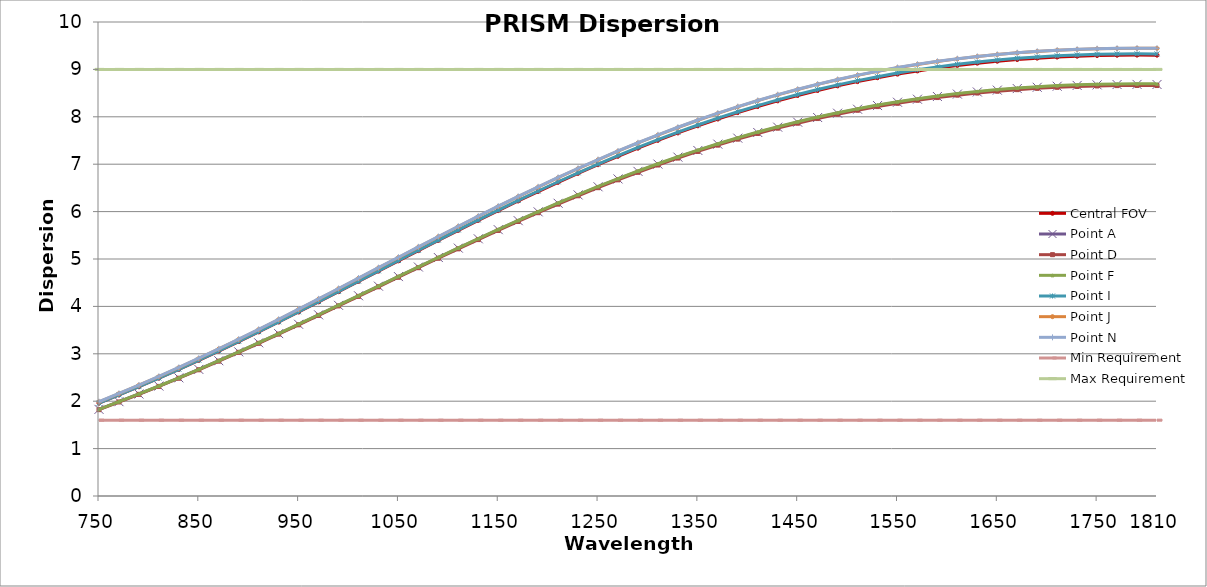
| Category | Central FOV | Point A | Point D | Point F | Point I | Point J | Point N | Min Requirement | Max Requirement |
|---|---|---|---|---|---|---|---|---|---|
| 750.0 | 1.958 | 1.828 | 1.822 | 1.828 | 1.96 | 1.986 | 1.988 | 1.6 | 9 |
| nan | 2.132 | 1.99 | 1.984 | 1.99 | 2.134 | 2.162 | 2.165 | 1.6 | 9 |
| nan | 2.306 | 2.152 | 2.145 | 2.153 | 2.308 | 2.338 | 2.341 | 1.6 | 9 |
| nan | 2.486 | 2.32 | 2.312 | 2.321 | 2.488 | 2.521 | 2.524 | 1.6 | 9 |
| nan | 2.671 | 2.493 | 2.485 | 2.494 | 2.674 | 2.709 | 2.712 | 1.6 | 9 |
| 850.0 | 2.862 | 2.671 | 2.663 | 2.672 | 2.865 | 2.903 | 2.906 | 1.6 | 9 |
| nan | 3.058 | 2.854 | 2.845 | 2.855 | 3.061 | 3.102 | 3.105 | 1.6 | 9 |
| nan | 3.259 | 3.041 | 3.032 | 3.042 | 3.262 | 3.305 | 3.309 | 1.6 | 9 |
| nan | 3.463 | 3.232 | 3.222 | 3.234 | 3.467 | 3.513 | 3.517 | 1.6 | 9 |
| nan | 3.671 | 3.426 | 3.415 | 3.428 | 3.676 | 3.724 | 3.728 | 1.6 | 9 |
| 950.0 | 3.882 | 3.623 | 3.612 | 3.625 | 3.887 | 3.938 | 3.942 | 1.6 | 9 |
| nan | 4.096 | 3.822 | 3.81 | 3.824 | 4.101 | 4.155 | 4.159 | 1.6 | 9 |
| nan | 4.311 | 4.022 | 4.01 | 4.025 | 4.316 | 4.373 | 4.377 | 1.6 | 9 |
| nan | 4.527 | 4.224 | 4.212 | 4.227 | 4.533 | 4.592 | 4.597 | 1.6 | 9 |
| nan | 4.744 | 4.427 | 4.414 | 4.43 | 4.75 | 4.813 | 4.817 | 1.6 | 9 |
| 1050.0 | 4.96 | 4.629 | 4.615 | 4.632 | 4.968 | 5.033 | 5.038 | 1.6 | 9 |
| nan | 5.176 | 4.831 | 4.816 | 4.834 | 5.184 | 5.252 | 5.257 | 1.6 | 9 |
| nan | 5.391 | 5.031 | 5.016 | 5.035 | 5.4 | 5.47 | 5.475 | 1.6 | 9 |
| nan | 5.604 | 5.23 | 5.214 | 5.234 | 5.613 | 5.686 | 5.691 | 1.6 | 9 |
| nan | 5.814 | 5.426 | 5.41 | 5.43 | 5.824 | 5.899 | 5.904 | 1.6 | 9 |
| 1150.0 | 6.021 | 5.619 | 5.602 | 5.624 | 6.031 | 6.109 | 6.115 | 1.6 | 9 |
| nan | 6.224 | 5.808 | 5.792 | 5.814 | 6.235 | 6.316 | 6.321 | 1.6 | 9 |
| nan | 6.423 | 5.994 | 5.977 | 6 | 6.435 | 6.518 | 6.523 | 1.6 | 9 |
| nan | 6.618 | 6.176 | 6.158 | 6.182 | 6.63 | 6.715 | 6.72 | 1.6 | 9 |
| nan | 6.806 | 6.352 | 6.334 | 6.358 | 6.819 | 6.907 | 6.912 | 1.6 | 9 |
| 1250.0 | 6.99 | 6.523 | 6.505 | 6.53 | 7.003 | 7.094 | 7.099 | 1.6 | 9 |
| nan | 7.167 | 6.689 | 6.67 | 6.696 | 7.182 | 7.274 | 7.279 | 1.6 | 9 |
| nan | 7.338 | 6.849 | 6.829 | 6.856 | 7.353 | 7.448 | 7.453 | 1.6 | 9 |
| nan | 7.503 | 7.002 | 6.982 | 7.01 | 7.518 | 7.614 | 7.62 | 1.6 | 9 |
| nan | 7.66 | 7.149 | 7.129 | 7.157 | 7.676 | 7.774 | 7.78 | 1.6 | 9 |
| 1350.0 | 7.81 | 7.29 | 7.269 | 7.298 | 7.827 | 7.927 | 7.932 | 1.6 | 9 |
| nan | 7.953 | 7.423 | 7.402 | 7.432 | 7.971 | 8.072 | 8.077 | 1.6 | 9 |
| nan | 8.089 | 7.55 | 7.529 | 7.559 | 8.107 | 8.21 | 8.215 | 1.6 | 9 |
| nan | 8.217 | 7.669 | 7.648 | 7.678 | 8.235 | 8.34 | 8.345 | 1.6 | 9 |
| nan | 8.337 | 7.781 | 7.76 | 7.791 | 8.356 | 8.463 | 8.467 | 1.6 | 9 |
| 1450.0 | 8.45 | 7.887 | 7.865 | 7.897 | 8.47 | 8.577 | 8.582 | 1.6 | 9 |
| nan | 8.555 | 7.985 | 7.963 | 7.995 | 8.575 | 8.684 | 8.688 | 1.6 | 9 |
| nan | 8.652 | 8.076 | 8.054 | 8.086 | 8.673 | 8.783 | 8.787 | 1.6 | 9 |
| nan | 8.742 | 8.16 | 8.138 | 8.171 | 8.764 | 8.875 | 8.879 | 1.6 | 9 |
| nan | 8.825 | 8.237 | 8.215 | 8.248 | 8.847 | 8.959 | 8.963 | 1.6 | 9 |
| 1550.0 | 8.9 | 8.307 | 8.285 | 8.319 | 8.922 | 9.035 | 9.039 | 1.6 | 9 |
| nan | 8.968 | 8.371 | 8.349 | 8.383 | 8.991 | 9.105 | 9.108 | 1.6 | 9 |
| nan | 9.029 | 8.428 | 8.406 | 8.44 | 9.053 | 9.167 | 9.17 | 1.6 | 9 |
| nan | 9.084 | 8.479 | 8.457 | 8.491 | 9.108 | 9.222 | 9.226 | 1.6 | 9 |
| nan | 9.132 | 8.524 | 8.501 | 8.536 | 9.156 | 9.271 | 9.274 | 1.6 | 9 |
| 1650.0 | 9.173 | 8.562 | 8.54 | 8.575 | 9.197 | 9.313 | 9.316 | 1.6 | 9 |
| nan | 9.208 | 8.596 | 8.573 | 8.608 | 9.233 | 9.349 | 9.352 | 1.6 | 9 |
| nan | 9.237 | 8.623 | 8.6 | 8.636 | 9.262 | 9.379 | 9.382 | 1.6 | 9 |
| nan | 9.261 | 8.645 | 8.622 | 8.658 | 9.286 | 9.403 | 9.406 | 1.6 | 9 |
| nan | 9.279 | 8.662 | 8.639 | 8.675 | 9.304 | 9.421 | 9.424 | 1.6 | 9 |
| 1750.0 | 9.292 | 8.674 | 8.651 | 8.687 | 9.318 | 9.434 | 9.437 | 1.6 | 9 |
| nan | 9.299 | 8.681 | 8.658 | 8.694 | 9.325 | 9.442 | 9.445 | 1.6 | 9 |
| nan | 9.302 | 8.684 | 8.661 | 8.697 | 9.328 | 9.445 | 9.448 | 1.6 | 9 |
| 1810.0 | 9.3 | 8.682 | 8.66 | 8.696 | 9.327 | 9.444 | 9.446 | 1.6 | 9 |